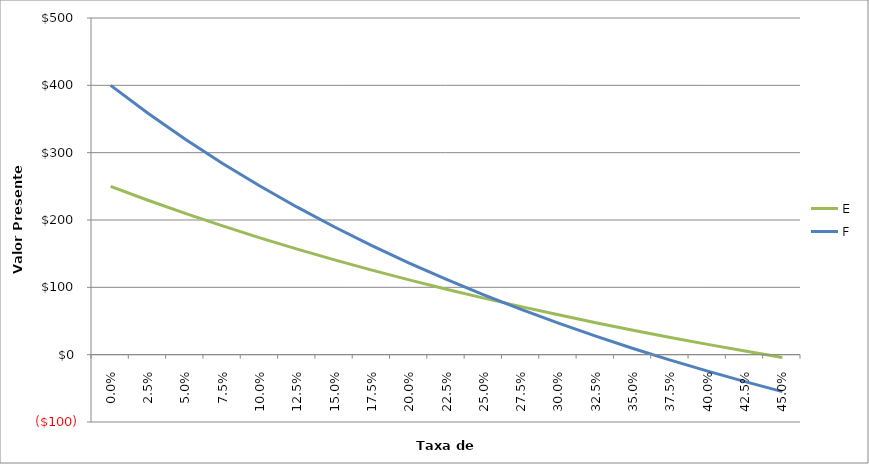
| Category | E | F |
|---|---|---|
| 0.0 | 250 | 400 |
| 0.025 | 229.328 | 358.537 |
| 0.05 | 209.751 | 319.955 |
| 0.075 | 191.184 | 283.991 |
| 0.1 | 173.554 | 250.413 |
| 0.125 | 156.79 | 219.012 |
| 0.15 | 140.832 | 189.603 |
| 0.175 | 125.622 | 162.019 |
| 0.2 | 111.111 | 136.111 |
| 0.225 | 97.251 | 111.745 |
| 0.25 | 84 | 88.8 |
| 0.275 | 71.319 | 67.166 |
| 0.3 | 59.172 | 46.746 |
| 0.325 | 47.526 | 27.447 |
| 0.35 | 36.351 | 9.191 |
| 0.375 | 25.62 | -8.099 |
| 0.4 | 15.306 | -24.49 |
| 0.425 | 5.386 | -40.043 |
| 0.45 | -4.162 | -54.816 |